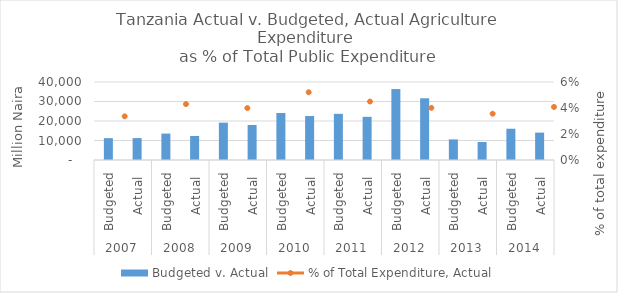
| Category | Budgeted v. Actual |
|---|---|
| 0 | 11211.779 |
| 1 | 11243.949 |
| 2 | 13553.74 |
| 3 | 12327.337 |
| 4 | 19152.86 |
| 5 | 17944.07 |
| 6 | 24090.991 |
| 7 | 22548.26 |
| 8 | 23670.709 |
| 9 | 22137.665 |
| 10 | 36371.97 |
| 11 | 31650.266 |
| 12 | 10563.939 |
| 13 | 9240.916 |
| 14 | 16035.21 |
| 15 | 14052.044 |